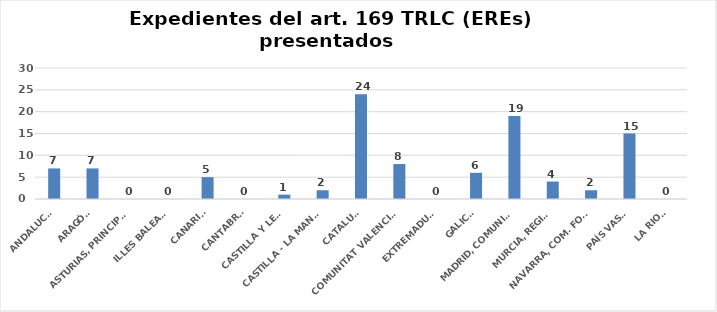
| Category | Series 0 |
|---|---|
| ANDALUCÍA | 7 |
| ARAGÓN | 7 |
| ASTURIAS, PRINCIPADO | 0 |
| ILLES BALEARS | 0 |
| CANARIAS | 5 |
| CANTABRIA | 0 |
| CASTILLA Y LEÓN | 1 |
| CASTILLA - LA MANCHA | 2 |
| CATALUÑA | 24 |
| COMUNITAT VALENCIANA | 8 |
| EXTREMADURA | 0 |
| GALICIA | 6 |
| MADRID, COMUNIDAD | 19 |
| MURCIA, REGIÓN | 4 |
| NAVARRA, COM. FORAL | 2 |
| PAÍS VASCO | 15 |
| LA RIOJA | 0 |